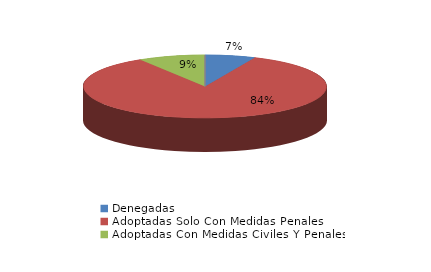
| Category | Series 0 |
|---|---|
| Denegadas | 3 |
| Adoptadas Solo Con Medidas Penales | 38 |
| Adoptadas Con Medidas Civiles Y Penales | 4 |
| Adoptadas Con Medidas Solo Civiles | 0 |